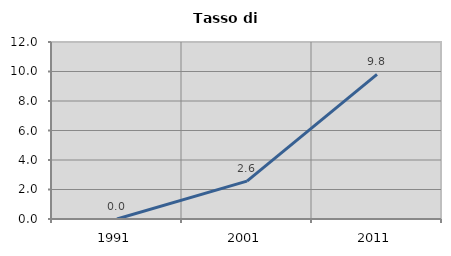
| Category | Tasso di disoccupazione   |
|---|---|
| 1991.0 | 0 |
| 2001.0 | 2.564 |
| 2011.0 | 9.804 |